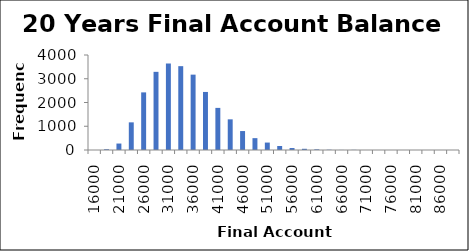
| Category | Frequency |
|---|---|
| 16000.0 | 0 |
| 18500.0 | 32 |
| 21000.0 | 272 |
| 23500.0 | 1164 |
| 26000.0 | 2426 |
| 28500.0 | 3291 |
| 31000.0 | 3642 |
| 33500.0 | 3530 |
| 36000.0 | 3173 |
| 38500.0 | 2444 |
| 41000.0 | 1773 |
| 43500.0 | 1291 |
| 46000.0 | 798 |
| 48500.0 | 499 |
| 51000.0 | 313 |
| 53500.0 | 169 |
| 56000.0 | 83 |
| 58500.0 | 51 |
| 61000.0 | 28 |
| 63500.0 | 11 |
| 66000.0 | 3 |
| 68500.0 | 6 |
| 71000.0 | 1 |
| 73500.0 | 0 |
| 76000.0 | 0 |
| 78500.0 | 0 |
| 81000.0 | 0 |
| 83500.0 | 0 |
| 86000.0 | 0 |
| More | 0 |